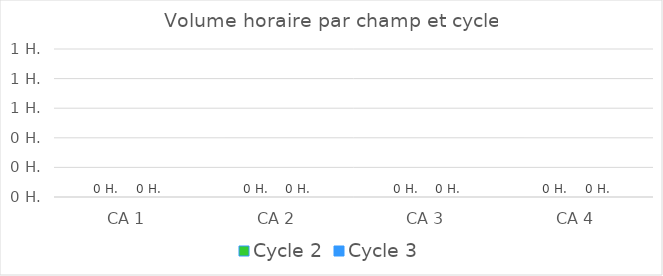
| Category | Cycle 2 | Cycle 3 |
|---|---|---|
| CA 1 | 0 | 0 |
| CA 2 | 0 | 0 |
| CA 3 | 0 | 0 |
| CA 4 | 0 | 0 |